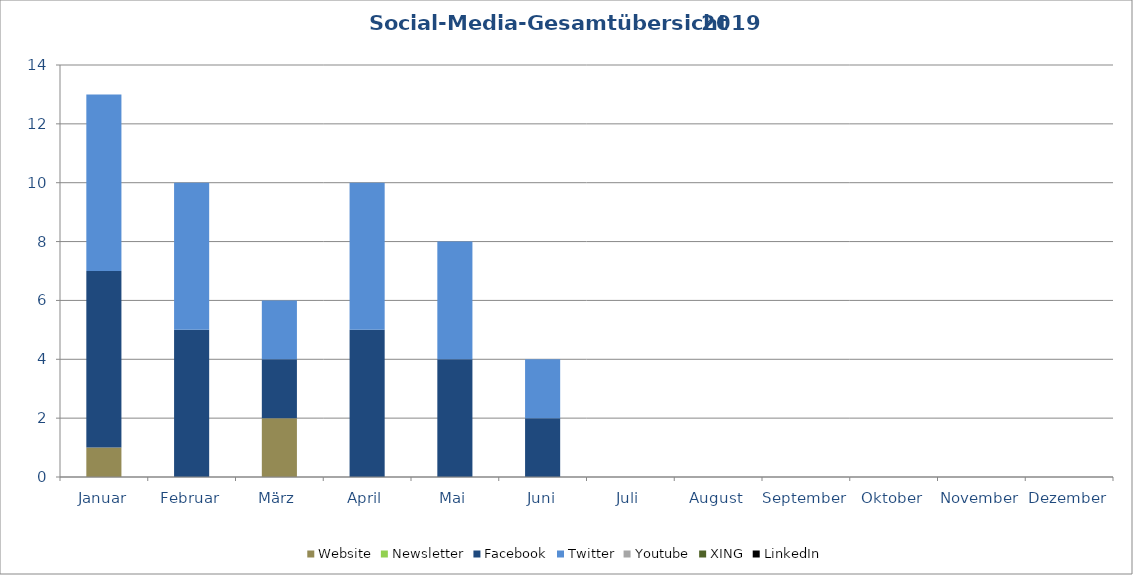
| Category | Website | Newsletter | Facebook | Twitter | Youtube | XING | LinkedIn |
|---|---|---|---|---|---|---|---|
| Januar | 1 | 0 | 6 | 6 | 0 | 0 | 0 |
| Februar | 0 | 0 | 5 | 5 | 0 | 0 | 0 |
| März | 2 | 0 | 2 | 2 | 0 | 0 | 0 |
| April | 0 | 0 | 5 | 5 | 0 | 0 | 0 |
| Mai | 0 | 0 | 4 | 4 | 0 | 0 | 0 |
| Juni | 0 | 0 | 2 | 2 | 0 | 0 | 0 |
| Juli | 0 | 0 | 0 | 0 | 0 | 0 | 0 |
| August | 0 | 0 | 0 | 0 | 0 | 0 | 0 |
| September | 0 | 0 | 0 | 0 | 0 | 0 | 0 |
| Oktober | 0 | 0 | 0 | 0 | 0 | 0 | 0 |
| November | 0 | 0 | 0 | 0 | 0 | 0 | 0 |
| Dezember | 0 | 0 | 0 | 0 | 0 | 0 | 0 |